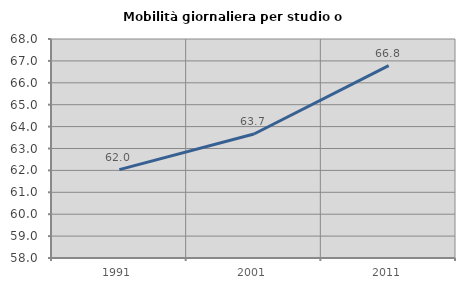
| Category | Mobilità giornaliera per studio o lavoro |
|---|---|
| 1991.0 | 62.034 |
| 2001.0 | 63.662 |
| 2011.0 | 66.784 |